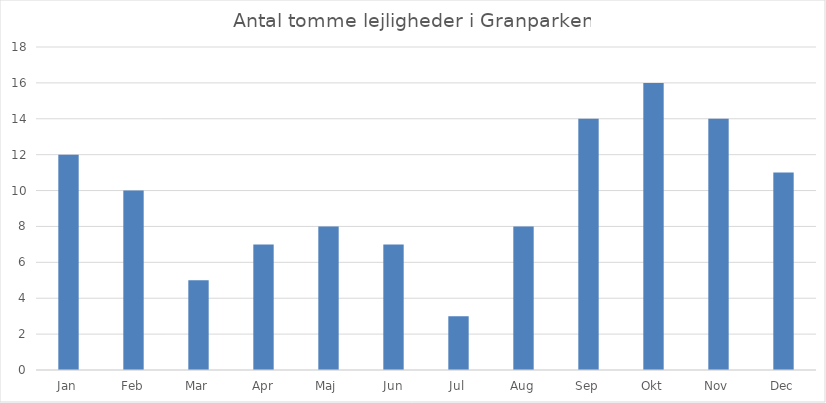
| Category | Series 0 |
|---|---|
| Jan | 12 |
| Feb | 10 |
| Mar | 5 |
| Apr | 7 |
| Maj | 8 |
| Jun | 7 |
| Jul | 3 |
| Aug | 8 |
| Sep | 14 |
| Okt | 16 |
| Nov | 14 |
| Dec | 11 |